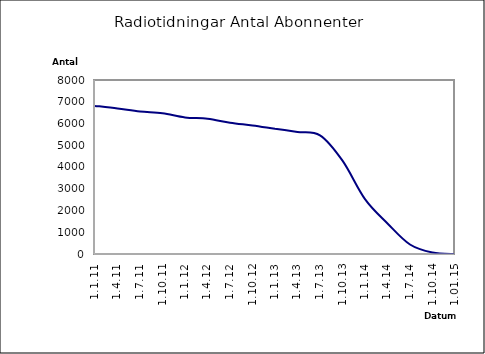
| Category | Series 0 |
|---|---|
| 1.1.11 | 6810 |
| 1.4.11 | 6692 |
| 1.7.11 | 6554 |
| 1.10.11 | 6473 |
| 1.1.12 | 6279 |
| 1.4.12 | 6218 |
| 1.7.12 | 6037 |
| 1.10.12 | 5909 |
| 1.1.13 | 5759 |
| 1.4.13 | 5612 |
| 1.7.13 | 5457 |
| 1.10.13 | 4291 |
| 1.1.14 | 2523 |
| 1.4.14 | 1405 |
| 1.7.14 | 436 |
| 1.10.14 | 69 |
| 1.01.15 | 0 |